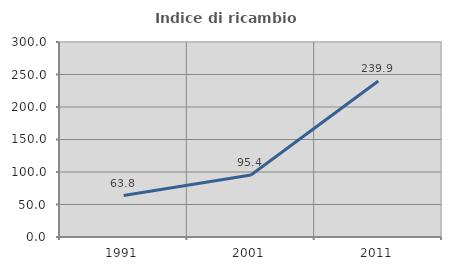
| Category | Indice di ricambio occupazionale  |
|---|---|
| 1991.0 | 63.846 |
| 2001.0 | 95.39 |
| 2011.0 | 239.904 |